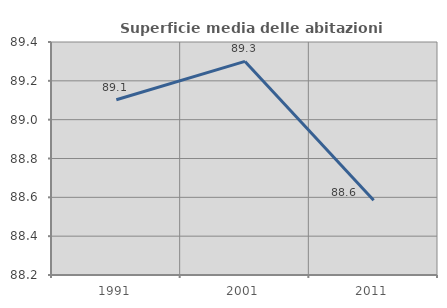
| Category | Superficie media delle abitazioni occupate |
|---|---|
| 1991.0 | 89.102 |
| 2001.0 | 89.3 |
| 2011.0 | 88.585 |